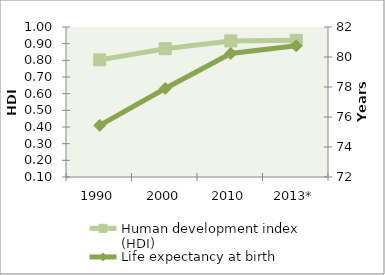
| Category | Human development index (HDI) |
|---|---|
| 1990 | 0.803 |
| 2000 | 0.87 |
| 2010 | 0.916 |
| 2013* | 0.92 |